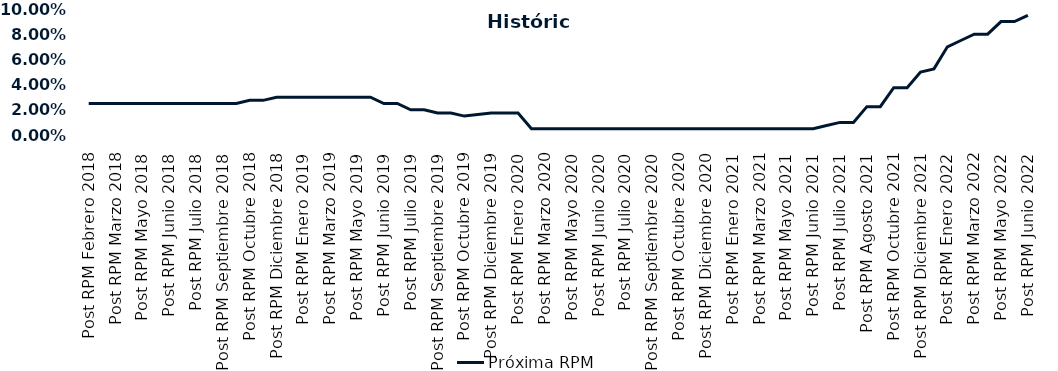
| Category | Próxima RPM |
|---|---|
| Post RPM Febrero 2018 | 0.025 |
| Pre RPM Marzo 2018 | 0.025 |
| Post RPM Marzo 2018 | 0.025 |
| Pre RPM Mayo 2018 | 0.025 |
| Post RPM Mayo 2018 | 0.025 |
| Pre RPM Junio 2018 | 0.025 |
| Post RPM Junio 2018 | 0.025 |
| Pre RPM Julio 2018 | 0.025 |
| Post RPM Julio 2018 | 0.025 |
| Pre RPM Septiembre 2018 | 0.025 |
| Post RPM Septiembre 2018 | 0.025 |
| Pre RPM Octubre 2018 | 0.025 |
| Post RPM Octubre 2018 | 0.028 |
| Pre RPM Diciembre 2018 | 0.028 |
| Post RPM Diciembre 2018 | 0.03 |
| Pre RPM Enero 2019 | 0.03 |
| Post RPM Enero 2019 | 0.03 |
| Pre RPM Marzo 2019 | 0.03 |
| Post RPM Marzo 2019 | 0.03 |
| Pre RPM Mayo 2019 | 0.03 |
| Post RPM Mayo 2019 | 0.03 |
| Pre RPM Junio 2019 | 0.03 |
| Post RPM Junio 2019 | 0.025 |
| Pre RPM Julio 2019 | 0.025 |
| Post RPM Julio 2019 | 0.02 |
| Pre RPM Septiembre 2019 | 0.02 |
| Post RPM Septiembre 2019 | 0.018 |
| Pre RPM Octubre 2019 | 0.018 |
| Post RPM Octubre 2019 | 0.015 |
| Pre RPM Diciembre 2019 | 0.016 |
| Post RPM Diciembre 2019 | 0.018 |
| Pre RPM Enero 2020 | 0.018 |
| Post RPM Enero 2020 | 0.018 |
| Pre RPM Marzo 2020 | 0.005 |
| Post RPM Marzo 2020 | 0.005 |
| Pre RPM Mayo 2020 | 0.005 |
| Post RPM Mayo 2020 | 0.005 |
| Pre RPM Junio 2020 | 0.005 |
| Post RPM Junio 2020 | 0.005 |
| Pre RPM Julio 2020 | 0.005 |
| Post RPM Julio 2020 | 0.005 |
| Pre RPM Septiembre 2020 | 0.005 |
| Post RPM Septiembre 2020 | 0.005 |
| Pre RPM Octubre 2020 | 0.005 |
| Post RPM Octubre 2020 | 0.005 |
| Pre RPM Diciembre 2020 | 0.005 |
| Post RPM Diciembre 2020 | 0.005 |
| Pre RPM Enero 2021 | 0.005 |
| Post RPM Enero 2021 | 0.005 |
| Pre RPM Marzo 2021 | 0.005 |
| Post RPM Marzo 2021 | 0.005 |
| Pre RPM Mayo 2021 | 0.005 |
| Post RPM Mayo 2021 | 0.005 |
| Pre RPM Junio 2021 | 0.005 |
| Post RPM Junio 2021 | 0.005 |
| Pre RPM Julio 2021 | 0.008 |
| Post RPM Julio 2021 | 0.01 |
| Pre RPM Agosto 2021 | 0.01 |
| Post RPM Agosto 2021 | 0.022 |
| Pre RPM Octubre 2021 | 0.022 |
| Post RPM Octubre 2021 | 0.038 |
| Pre RPM Diciembre 2021 | 0.038 |
| Post RPM Diciembre 2021 | 0.05 |
| Pre RPM Enero 2022 | 0.052 |
| Post RPM Enero 2022 | 0.07 |
| Pre RPM Marzo 2022 | 0.075 |
| Post RPM Marzo 2022 | 0.08 |
| Pre RPM Mayo 2022 | 0.08 |
| Post RPM Mayo 2022 | 0.09 |
| Pre RPM Junio 2022 | 0.09 |
| Post RPM Junio 2022 | 0.095 |